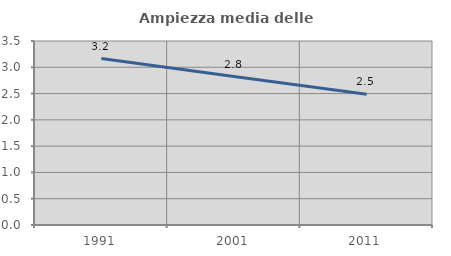
| Category | Ampiezza media delle famiglie |
|---|---|
| 1991.0 | 3.165 |
| 2001.0 | 2.825 |
| 2011.0 | 2.489 |